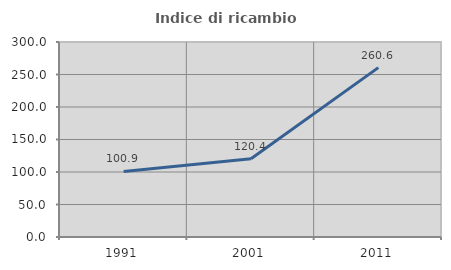
| Category | Indice di ricambio occupazionale  |
|---|---|
| 1991.0 | 100.909 |
| 2001.0 | 120.43 |
| 2011.0 | 260.571 |